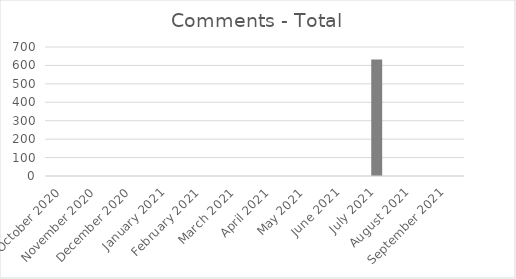
| Category | Total |
|---|---|
| October 2020 | 0 |
| November 2020 | 0 |
| December 2020 | 0 |
| January 2021 | 0 |
| February 2021 | 0 |
| March 2021 | 0 |
| April 2021 | 0 |
| May 2021 | 0 |
| June 2021 | 0 |
| July 2021 | 632 |
| August 2021 | 0 |
| September 2021 | 0 |